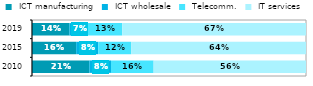
| Category |  ICT manufacturing |  ICT wholesale |  Telecomm. |  IT services |
|---|---|---|---|---|
| 2010.0 | 0.209 | 0.079 | 0.156 | 0.556 |
| 2015.0 | 0.161 | 0.08 | 0.12 | 0.638 |
| 2019.0 | 0.137 | 0.065 | 0.127 | 0.671 |